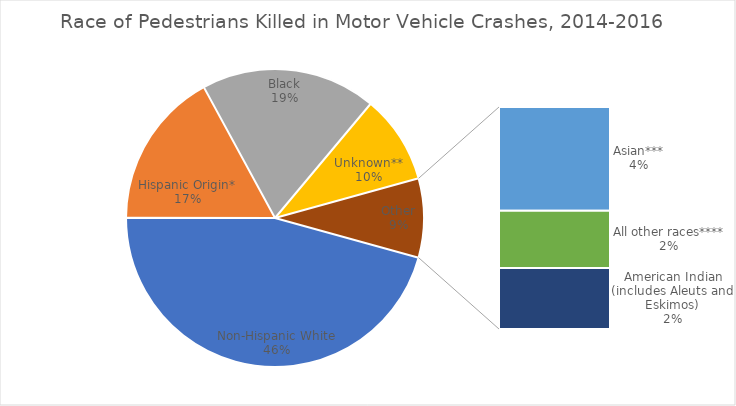
| Category | Percent of Pedestrian Fatalities |
|---|---|
| Non-Hispanic White | 0.457 |
| Hispanic Origin* | 0.17 |
| Black | 0.19 |
| Unknown** | 0.096 |
| Asian*** | 0.04 |
| All other races**** | 0.022 |
| American Indian (includes Aleuts and Eskimos) | 0.024 |